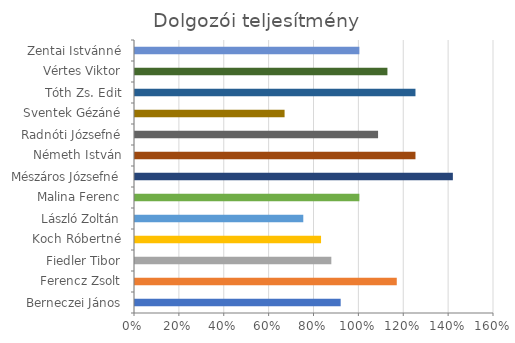
| Category | Teljesítmény |
|---|---|
| Berneczei János | 0.917 |
| Ferencz Zsolt | 1.167 |
| Fiedler Tibor | 0.875 |
| Koch Róbertné | 0.829 |
| László Zoltán | 0.75 |
| Malina Ferenc | 1 |
| Mészáros Józsefné | 1.417 |
| Németh István | 1.25 |
| Radnóti Józsefné | 1.083 |
| Sventek Gézáné | 0.667 |
| Tóth Zs. Edit | 1.25 |
| Vértes Viktor | 1.125 |
| Zentai Istvánné | 1 |